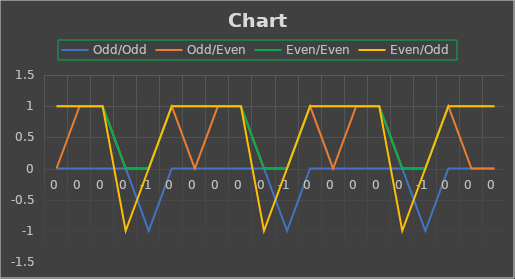
| Category | Odd/Odd | Odd/Even | Even/Even | Even/Odd |
|---|---|---|---|---|
| 0.0 | 0 | 0 | 1 | 0 |
| 0.0 | 0 | 1 | 0 | 0 |
| 0.0 | 0 | 1 | 0 | 0 |
| 0.0 | 0 | 0 | 0 | -1 |
| -1.0 | -1 | 0 | 0 | 0 |
| 0.0 | 0 | 1 | 0 | 0 |
| 0.0 | 0 | 0 | 1 | 0 |
| 0.0 | 0 | 1 | 0 | 0 |
| 0.0 | 0 | 1 | 0 | 0 |
| 0.0 | 0 | 0 | 0 | -1 |
| -1.0 | -1 | 0 | 0 | 0 |
| 0.0 | 0 | 1 | 0 | 0 |
| 0.0 | 0 | 0 | 1 | 0 |
| 0.0 | 0 | 1 | 0 | 0 |
| 0.0 | 0 | 1 | 0 | 0 |
| 0.0 | 0 | 0 | 0 | -1 |
| -1.0 | -1 | 0 | 0 | 0 |
| 0.0 | 0 | 1 | 0 | 0 |
| 0.0 | 0 | 0 | 1 | 0 |
| 0.0 | 0 | 0 | 1 | 0 |